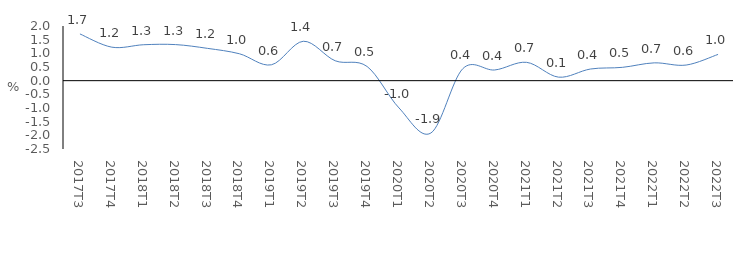
| Category | Series 0 |
|---|---|
| 2017Τ3 | 1.709 |
| 2017Τ4 | 1.225 |
| 2018Τ1 | 1.315 |
| 2018Τ2 | 1.319 |
| 2018Τ3 | 1.181 |
| 2018Τ4 | 0.984 |
| 2019Τ1 | 0.581 |
| 2019Τ2 | 1.442 |
| 2019Τ3 | 0.728 |
| 2019Τ4 | 0.518 |
| 2020Τ1 | -0.998 |
| 2020Τ2 | -1.915 |
| 2020Τ3 | 0.439 |
| 2020Τ4 | 0.391 |
| 2021Τ1 | 0.67 |
| 2021Τ2 | 0.129 |
| 2021Τ3 | 0.426 |
| 2021Τ4 | 0.487 |
| 2022Τ1 | 0.652 |
| 2022Τ2 | 0.571 |
| 2022Τ3 | 0.961 |